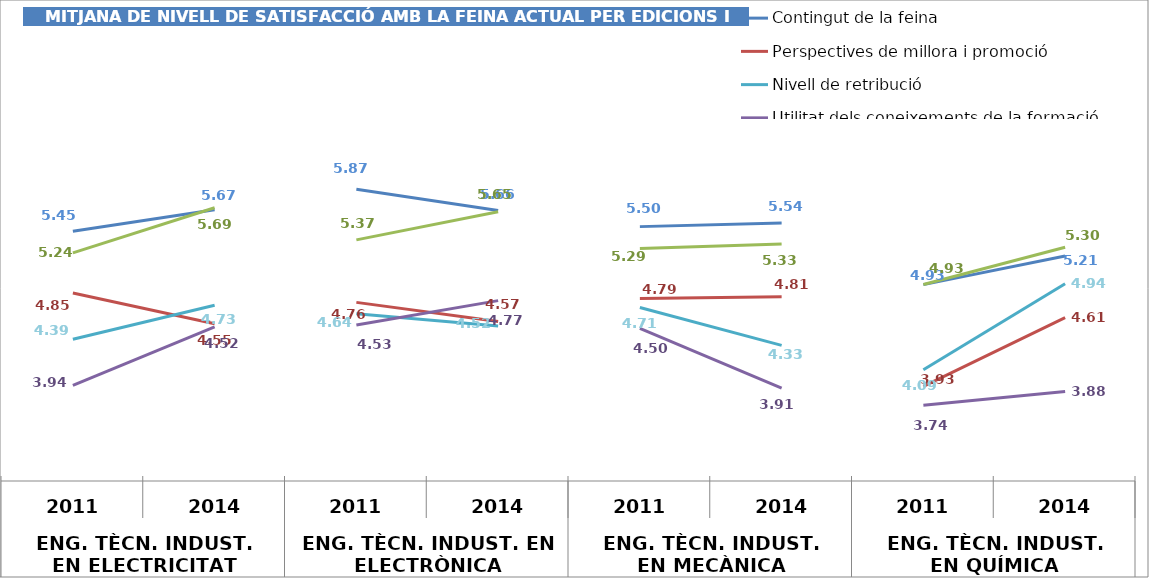
| Category | Contingut de la feina | Perspectives de millora i promoció | Nivell de retribució | Utilitat dels coneixements de la formació universitària | Satisfacció general amb la feina * |
|---|---|---|---|---|---|
| 0 | 5.455 | 4.848 | 4.394 | 3.939 | 5.242 |
| 1 | 5.667 | 4.545 | 4.727 | 4.515 | 5.686 |
| 2 | 5.867 | 4.756 | 4.644 | 4.533 | 5.37 |
| 3 | 5.659 | 4.568 | 4.523 | 4.773 | 5.646 |
| 4 | 5.5 | 4.794 | 4.706 | 4.5 | 5.286 |
| 5 | 5.536 | 4.812 | 4.333 | 3.913 | 5.329 |
| 6 | 4.93 | 3.93 | 4.093 | 3.744 | 4.932 |
| 7 | 5.212 | 4.606 | 4.939 | 3.879 | 5.297 |